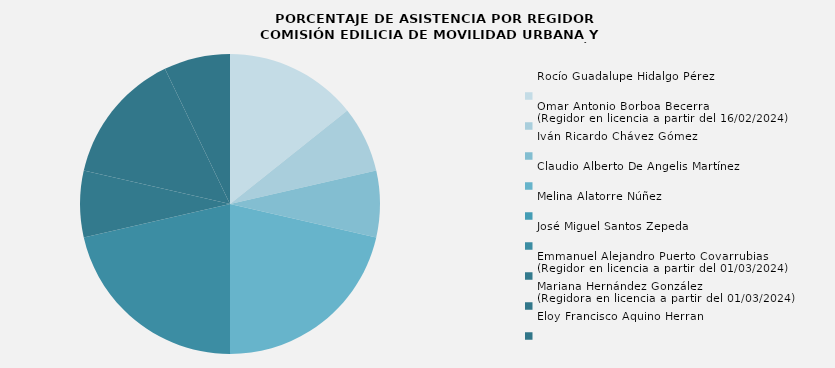
| Category | Rocío Guadalupe Hidalgo Pérez |
|---|---|
| Rocío Guadalupe Hidalgo Pérez | 66.667 |
| Omar Antonio Borboa Becerra 
(Regidor en licencia a partir del 16/02/2024) | 33.333 |
| Iván Ricardo Chávez Gómez | 33.333 |
| Claudio Alberto De Angelis Martínez | 100 |
| Melina Alatorre Núñez | 0 |
| José Miguel Santos Zepeda | 100 |
| Emmanuel Alejandro Puerto Covarrubias
(Regidor en licencia a partir del 01/03/2024) | 33.333 |
| Mariana Hernández González
(Regidora en licencia a partir del 01/03/2024) | 66.667 |
| Eloy Francisco Aquino Herran | 33.333 |